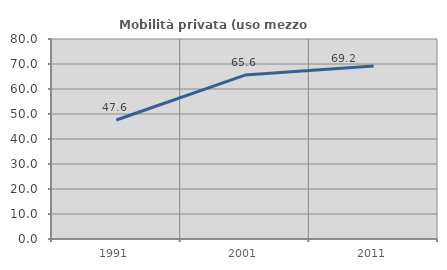
| Category | Mobilità privata (uso mezzo privato) |
|---|---|
| 1991.0 | 47.586 |
| 2001.0 | 65.574 |
| 2011.0 | 69.231 |